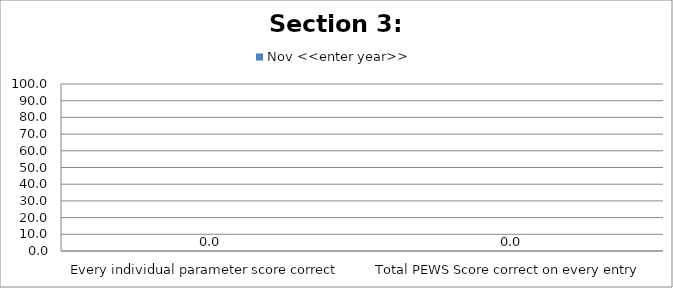
| Category | Nov <<enter year>> |
|---|---|
| Every individual parameter score correct  | 0 |
| Total PEWS Score correct on every entry | 0 |